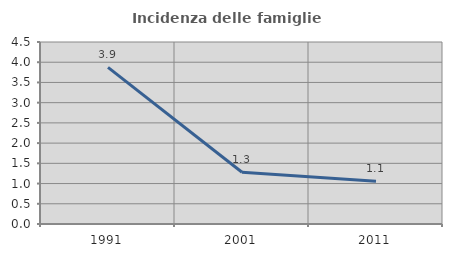
| Category | Incidenza delle famiglie numerose |
|---|---|
| 1991.0 | 3.872 |
| 2001.0 | 1.279 |
| 2011.0 | 1.059 |